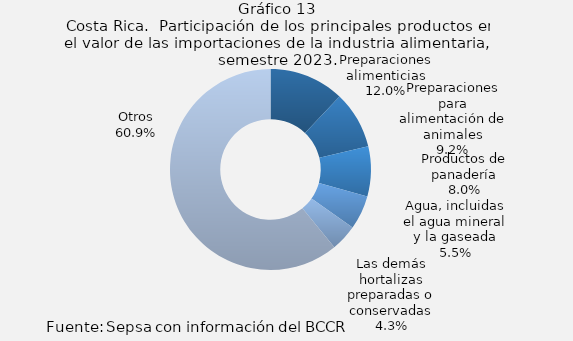
| Category | Series 0 |
|---|---|
| Preparaciones alimenticias | 12.044 |
| Preparaciones para alimentación de animales | 9.238 |
| Productos de panadería | 8.026 |
| Agua, incluidas el agua mineral y la gaseada | 5.484 |
| Las demás hortalizas preparadas o conservadas | 4.26 |
| Otros | 60.947 |